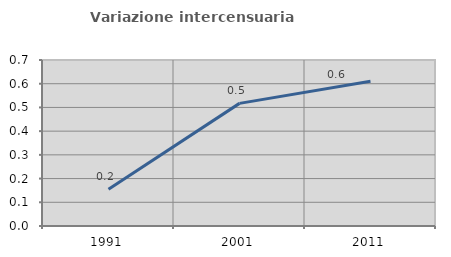
| Category | Variazione intercensuaria annua |
|---|---|
| 1991.0 | 0.155 |
| 2001.0 | 0.517 |
| 2011.0 | 0.61 |